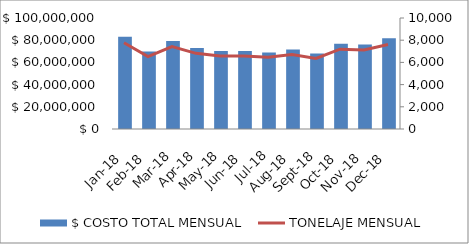
| Category | $ COSTO TOTAL MENSUAL |
|---|---|
| 2018-01-01 | 83017575 |
| 2018-02-01 | 69786430 |
| 2018-03-01 | 79305650 |
| 2018-04-01 | 72861138 |
| 2018-05-01 | 70331943 |
| 2018-06-01 | 70331943 |
| 2018-07-01 | 68990925 |
| 2018-08-01 | 71624329 |
| 2018-09-01 | 67945645 |
| 2018-10-01 | 76854049 |
| 2018-11-01 | 76152707 |
| 2018-12-01 | 81781086 |